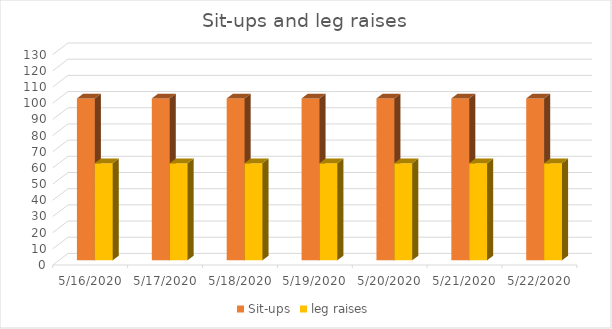
| Category | Sit-ups | leg raises |
|---|---|---|
| 5/16/20 | 100 | 60 |
| 5/17/20 | 100 | 60 |
| 5/18/20 | 100 | 60 |
| 5/19/20 | 100 | 60 |
| 5/20/20 | 100 | 60 |
| 5/21/20 | 100 | 60 |
| 5/22/20 | 100 | 60 |